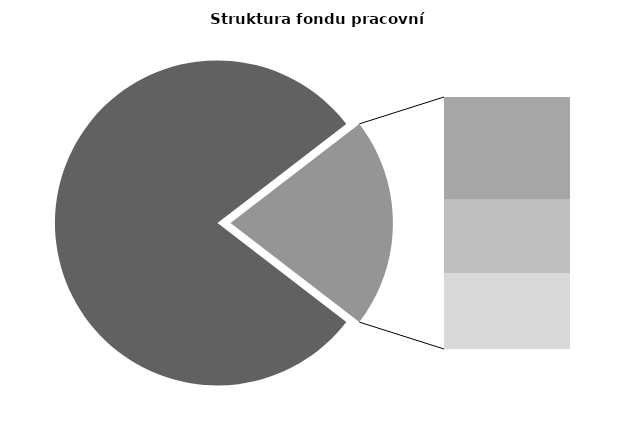
| Category | Series 0 |
|---|---|
| Průměrná měsíční odpracovaná doba bez přesčasu | 134.106 |
| Dovolená | 14.441 |
| Nemoc | 10.287 |
| Jiné | 10.654 |